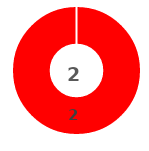
| Category | Series 0 |
|---|---|
| 0 | 0 |
| 1 | 0 |
| 2 | 0 |
| 3 | 2 |
| 4 | 0 |